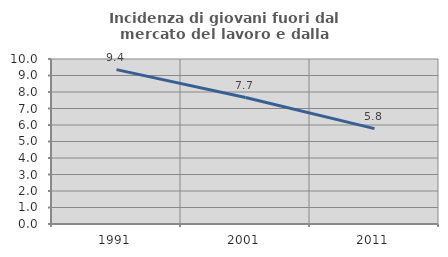
| Category | Incidenza di giovani fuori dal mercato del lavoro e dalla formazione  |
|---|---|
| 1991.0 | 9.355 |
| 2001.0 | 7.666 |
| 2011.0 | 5.78 |